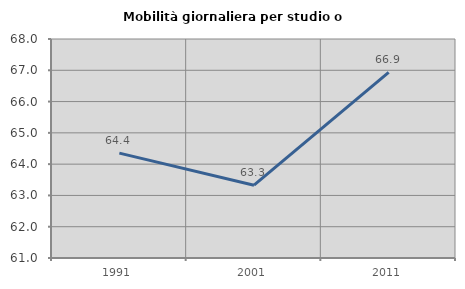
| Category | Mobilità giornaliera per studio o lavoro |
|---|---|
| 1991.0 | 64.352 |
| 2001.0 | 63.326 |
| 2011.0 | 66.934 |